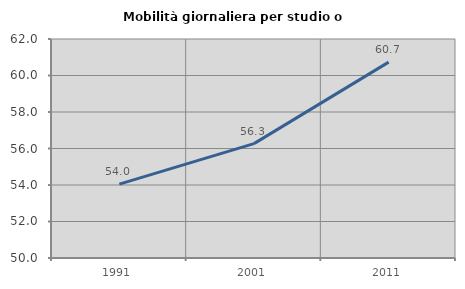
| Category | Mobilità giornaliera per studio o lavoro |
|---|---|
| 1991.0 | 54.048 |
| 2001.0 | 56.267 |
| 2011.0 | 60.735 |